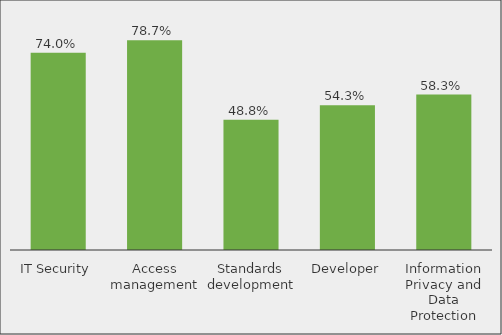
| Category | Series 0 |
|---|---|
| IT Security | 0.74 |
| Access management | 0.787 |
| Standards development | 0.488 |
| Developer | 0.543 |
| Information Privacy and Data Protection | 0.583 |